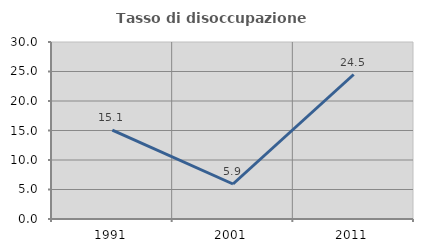
| Category | Tasso di disoccupazione giovanile  |
|---|---|
| 1991.0 | 15.068 |
| 2001.0 | 5.932 |
| 2011.0 | 24.49 |